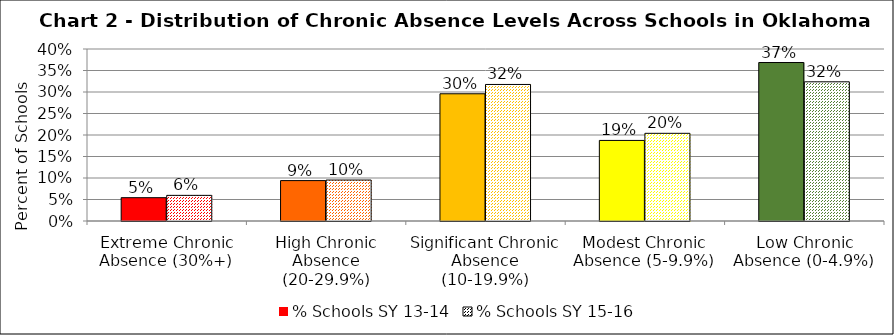
| Category | % Schools SY 13-14 | % Schools SY 15-16 |
|---|---|---|
| Extreme Chronic Absence (30%+) | 0.054 | 0.06 |
| High Chronic Absence (20-29.9%) | 0.094 | 0.095 |
| Significant Chronic Absence (10-19.9%) | 0.296 | 0.318 |
| Modest Chronic Absence (5-9.9%) | 0.187 | 0.204 |
| Low Chronic Absence (0-4.9%) | 0.369 | 0.324 |